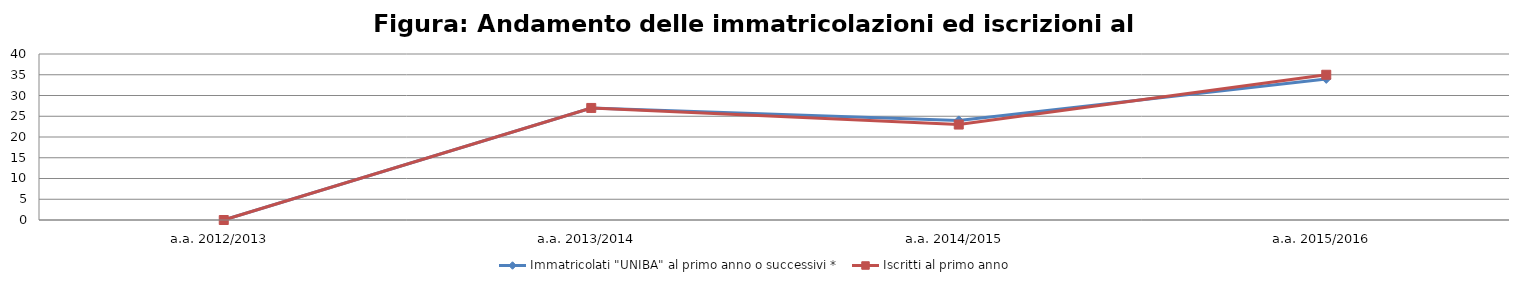
| Category | Immatricolati "UNIBA" al primo anno o successivi * | Iscritti al primo anno  |
|---|---|---|
| a.a. 2012/2013 | 0 | 0 |
| a.a. 2013/2014 | 27 | 27 |
| a.a. 2014/2015 | 24 | 23 |
| a.a. 2015/2016 | 34 | 35 |